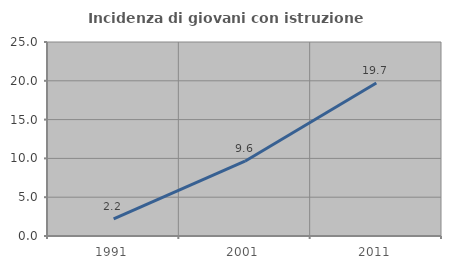
| Category | Incidenza di giovani con istruzione universitaria |
|---|---|
| 1991.0 | 2.222 |
| 2001.0 | 9.639 |
| 2011.0 | 19.718 |